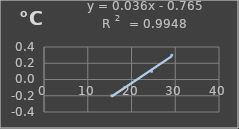
| Category | Temperatura |
|---|---|
| 15.5 | -0.2 |
| 24.6 | 0.1 |
| 29.2 | 0.3 |